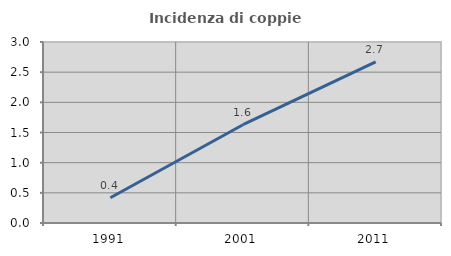
| Category | Incidenza di coppie miste |
|---|---|
| 1991.0 | 0.419 |
| 2001.0 | 1.629 |
| 2011.0 | 2.672 |